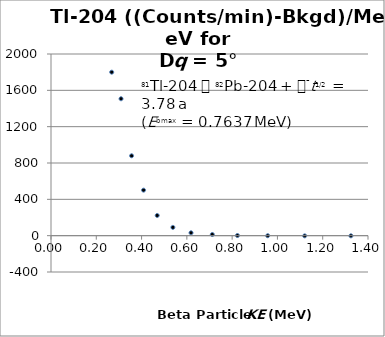
| Category | Series 0 |
|---|---|
| 0.2680227366322104 | 1799.912 |
| 0.309304754344384 | 1507.493 |
| 0.35590877077319627 | 879.55 |
| 0.4087613453094022 | 501.079 |
| 0.4690432505833301 | 222.298 |
| 0.5382797505768625 | 91.111 |
| 0.6184725682258746 | 31.717 |
| 0.7122978664250175 | 12.827 |
| 0.8234122552039224 | 1.516 |
| 0.9569424467790375 | -0.729 |
| 1.1203013982320613 | -2.05 |
| 1.3246166201445688 | -1.614 |